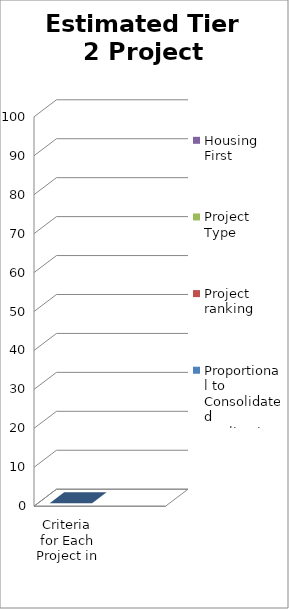
| Category | Proportional to Consolidated Application | Project ranking | Project Type | Housing First |
|---|---|---|---|---|
| Criteria for Each Project in Tier 2 | 0 |  |  |  |